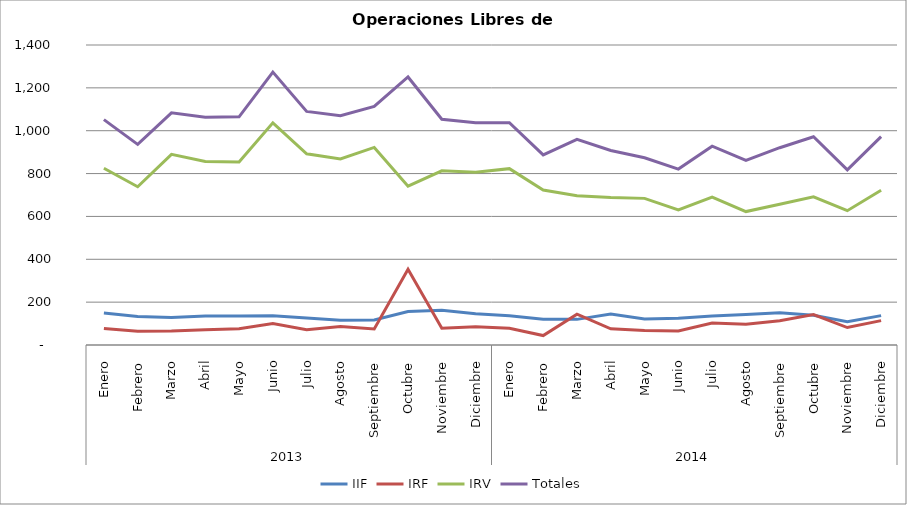
| Category | IIF | IRF | IRV | Totales |
|---|---|---|---|---|
| 0 | 149.455 | 77.455 | 824.773 | 1051.682 |
| 1 | 133.225 | 64.6 | 738.45 | 936.275 |
| 2 | 127.875 | 65.8 | 889.8 | 1083.475 |
| 3 | 135.705 | 70.591 | 856.318 | 1062.614 |
| 4 | 135.024 | 75.381 | 854.238 | 1064.643 |
| 5 | 136.55 | 100.35 | 1036.75 | 1273.65 |
| 6 | 126.545 | 71.409 | 892.091 | 1090.045 |
| 7 | 114.952 | 86.476 | 868.381 | 1069.81 |
| 8 | 116.917 | 74.556 | 922.056 | 1113.528 |
| 9 | 155.841 | 353.636 | 741.455 | 1250.932 |
| 10 | 162.675 | 77.8 | 812.9 | 1053.375 |
| 11 | 146.35 | 84.675 | 806.15 | 1037.175 |
| 12 | 136.159 | 78.227 | 823 | 1037.386 |
| 13 | 119.95 | 43.925 | 723.1 | 886.975 |
| 14 | 119.595 | 143.714 | 696.238 | 959.548 |
| 15 | 144.214 | 75.667 | 687.857 | 907.738 |
| 16 | 121.6 | 67.95 | 684.25 | 873.8 |
| 17 | 124.976 | 65.571 | 630.476 | 821.024 |
| 18 | 134.977 | 102.682 | 690.227 | 927.886 |
| 19 | 142.2 | 96.45 | 622.7 | 861.35 |
| 20 | 150.8 | 112.725 | 657.15 | 920.675 |
| 21 | 138.477 | 141.773 | 691.364 | 971.614 |
| 22 | 108.75 | 81.45 | 626.85 | 817.05 |
| 23 | 137 | 113.8 | 721.8 | 972.6 |